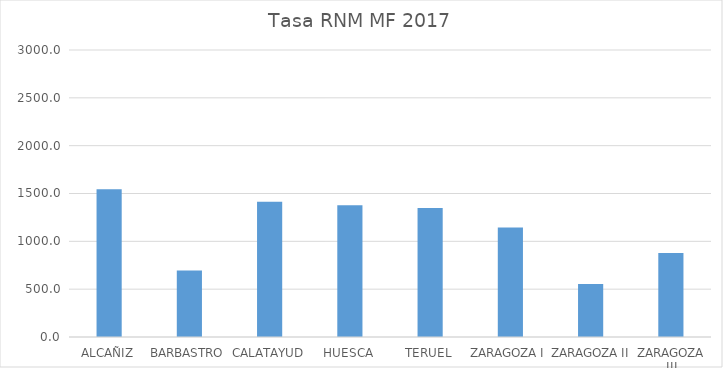
| Category | Series 0 |
|---|---|
| ALCAÑIZ | 1543.599 |
| BARBASTRO | 694.009 |
| CALATAYUD | 1415.001 |
| HUESCA | 1377.207 |
| TERUEL | 1348.081 |
| ZARAGOZA I | 1145.177 |
| ZARAGOZA II | 553.242 |
| ZARAGOZA III | 878.226 |